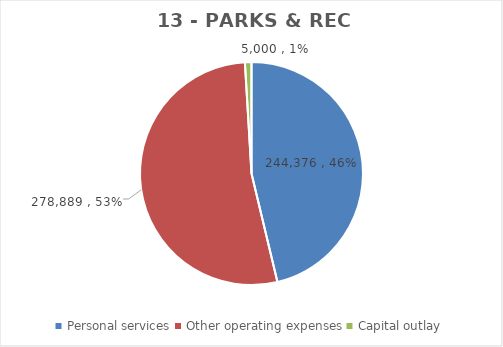
| Category | Series 0 | Series 1 | Series 2 | Series 3 | Series 4 | Series 5 | Series 6 | Series 7 |
|---|---|---|---|---|---|---|---|---|
| Personal services | 244376 |  |  | 231533 | 246602 | 244376 | 244376 | 250595 |
| Other operating expenses | 278889 |  |  | 269711 | 278686 | 275254 | 278889 | 278889 |
| Capital outlay | 5000 |  |  | 211609 | 37500 | 235000 | 5000 | 5000 |